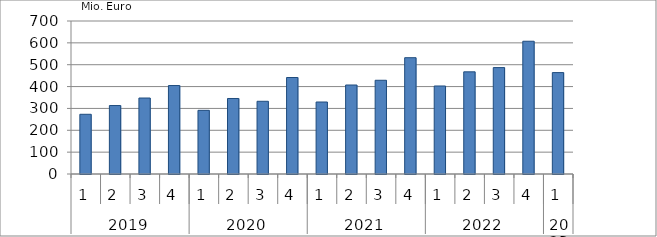
| Category | Ausbaugewerblicher Umsatz3 |
|---|---|
| 0 | 273159.137 |
| 1 | 313254.251 |
| 2 | 347631.281 |
| 3 | 404721.054 |
| 4 | 291272.144 |
| 5 | 345494.215 |
| 6 | 332629.265 |
| 7 | 441463.36 |
| 8 | 329380.212 |
| 9 | 407164.972 |
| 10 | 428783.222 |
| 11 | 532137.089 |
| 12 | 402625.565 |
| 13 | 467398.849 |
| 14 | 486819.26 |
| 15 | 607390.303 |
| 16 | 463895.067 |